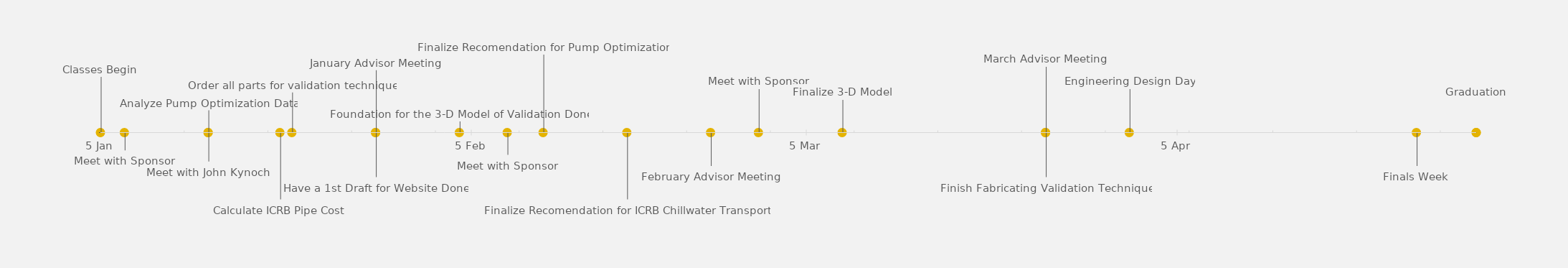
| Category | POSITION |
|---|---|
| Classes Begin | 25 |
| Meet with Sponsor | -8 |
| Meet with John Kynoch | -13 |
| Analyze Pump Optimization Data | 10 |
| Calculate ICRB Pipe Cost | -30 |
| Order all parts for validation technique | 18 |
| January Advisor Meeting | 28 |
| Have a 1st Draft for Website Done | -20 |
| Foundation for the 3-D Model of Validation Done | 5 |
| Meet with Sponsor | -10 |
| Finalize Recomendation for Pump Optimization | 35 |
| Finalize Recomendation for ICRB Chillwater Transport | -30 |
| February Advisor Meeting | -15 |
| Meet with Sponsor | 20 |
| Finalize 3-D Model | 15 |
| March Advisor Meeting | 30 |
| Finish Fabricating Validation Technique | -20 |
| Engineering Design Day | 20 |
| Finals Week | -15 |
| Graduation | 15 |
| Graduation | 15 |